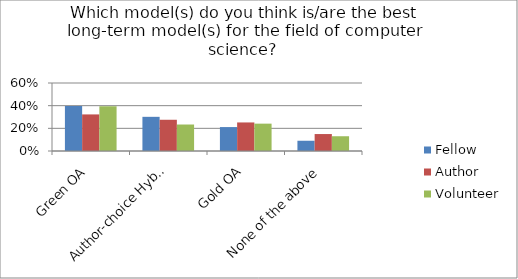
| Category | Fellow | Author | Volunteer |
|---|---|---|---|
| Green OA | 0.397 | 0.323 | 0.395 |
| Author-choice Hybrid OA | 0.302 | 0.276 | 0.234 |
| Gold OA | 0.211 | 0.252 | 0.241 |
| None of the above | 0.09 | 0.15 | 0.13 |